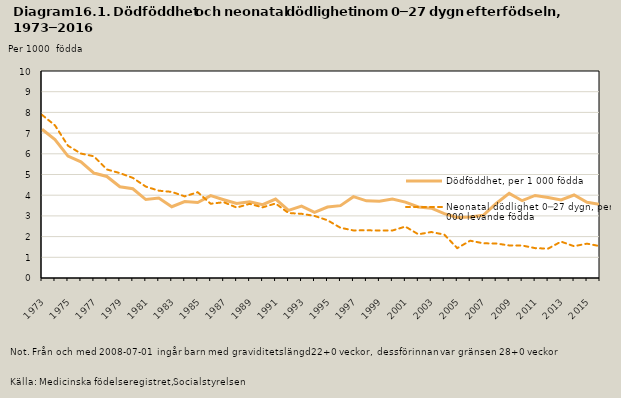
| Category | Dödföddhet, per 1 000 födda | Neonatal dödlighet 0─27 dygn, per 1 000 levande födda |
|---|---|---|
| 1973 | 7.184 | 7.881 |
| 1974 | 6.689 | 7.374 |
| 1975 | 5.89 | 6.391 |
| 1976 | 5.612 | 6.012 |
| 1977 | 5.069 | 5.88 |
| 1978 | 4.906 | 5.243 |
| 1979 | 4.409 | 5.067 |
| 1980 | 4.31 | 4.838 |
| 1981 | 3.79 | 4.415 |
| 1982 | 3.866 | 4.219 |
| 1983 | 3.444 | 4.161 |
| 1984 | 3.692 | 3.943 |
| 1985 | 3.648 | 4.144 |
| 1986 | 3.977 | 3.586 |
| 1987 | 3.783 | 3.662 |
| 1988 | 3.597 | 3.403 |
| 1989 | 3.682 | 3.582 |
| 1990 | 3.539 | 3.413 |
| 1991 | 3.812 | 3.599 |
| 1992 | 3.266 | 3.138 |
| 1993 | 3.475 | 3.102 |
| 1994 | 3.169 | 2.998 |
| 1995 | 3.427 | 2.79 |
| 1996 | 3.494 | 2.426 |
| 1997 | 3.929 | 2.299 |
| 1998 | 3.728 | 2.304 |
| 1999 | 3.703 | 2.295 |
| 2000 | 3.812 | 2.294 |
| 2001 | 3.668 | 2.484 |
| 2002 | 3.429 | 2.111 |
| 2003 | 3.372 | 2.221 |
| 2004 | 3.109 | 2.096 |
| 2005 | 2.928 | 1.443 |
| 2006 | 2.945 | 1.803 |
| 2007 | 3.029 | 1.675 |
| 2008* | 3.6 | 1.667 |
| 2009 | 4.09 | 1.573 |
| 2010 | 3.734 | 1.569 |
| 2011 | 3.987 | 1.443 |
| 2012 | 3.893 | 1.419 |
| 2013 | 3.774 | 1.757 |
| 2014 | 4.01 | 1.536 |
| 2015 | 3.66 | 1.66 |
| 2016 | 3.555 | 1.536 |